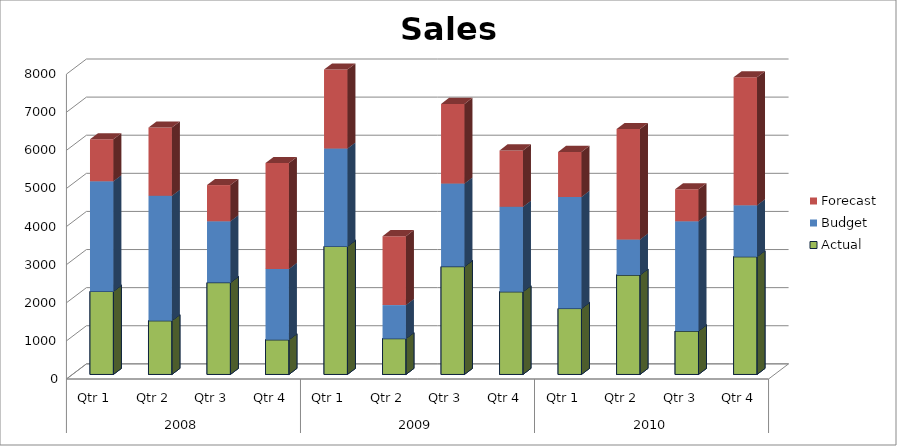
| Category | Actual | Budget | Forecast |
|---|---|---|---|
| 0 | 2180 | 2890 | 1100 |
| 1 | 1410 | 3280 | 1790 |
| 2 | 2410 | 1610 | 950 |
| 3 | 910 | 1860 | 2780 |
| 4 | 3360 | 2570 | 2070 |
| 5 | 940 | 880 | 1810 |
| 6 | 2830 | 2180 | 2090 |
| 7 | 2170 | 2230 | 1480 |
| 8 | 1730 | 2930 | 1180 |
| 9 | 2610 | 930 | 2900 |
| 10 | 1140 | 2880 | 840 |
| 11 | 3090 | 1350 | 3360 |